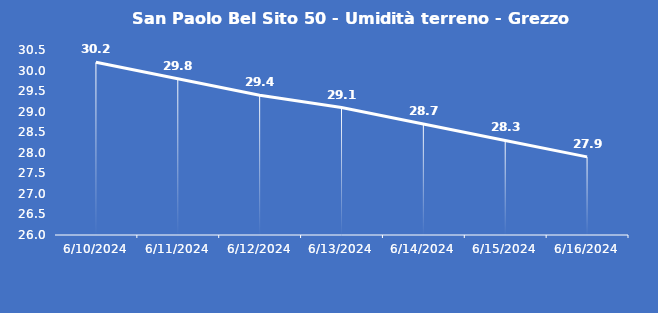
| Category | San Paolo Bel Sito 50 - Umidità terreno - Grezzo (%VWC) |
|---|---|
| 6/10/24 | 30.2 |
| 6/11/24 | 29.8 |
| 6/12/24 | 29.4 |
| 6/13/24 | 29.1 |
| 6/14/24 | 28.7 |
| 6/15/24 | 28.3 |
| 6/16/24 | 27.9 |